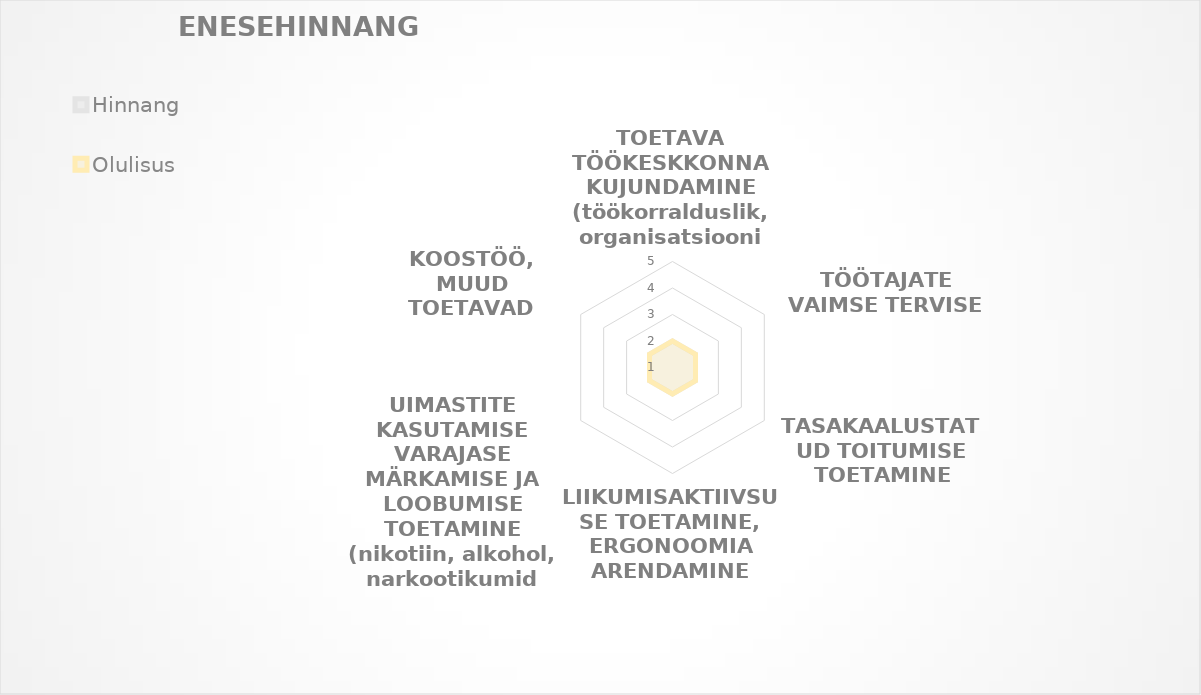
| Category | Hinnang | Olulisus |
|---|---|---|
| TOETAVA TÖÖKESKKONNA KUJUNDAMINE (töökorralduslik, organisatsiooni tase) | 0 | 0 |
| TÖÖTAJATE VAIMSE TERVISE TOETAMINE | 0 | 0 |
| TASAKAALUSTATUD TOITUMISE TOETAMINE | 0 | 0 |
| LIIKUMISAKTIIVSUSE TOETAMINE, ERGONOOMIA ARENDAMINE | 0 | 0 |
| UIMASTITE KASUTAMISE VARAJASE MÄRKAMISE JA LOOBUMISE TOETAMINE (nikotiin, alkohol, narkootikumid jms) | 0 | 0 |
| KOOSTÖÖ, MUUD TOETAVAD TEGEVUSED | 0 | 0 |